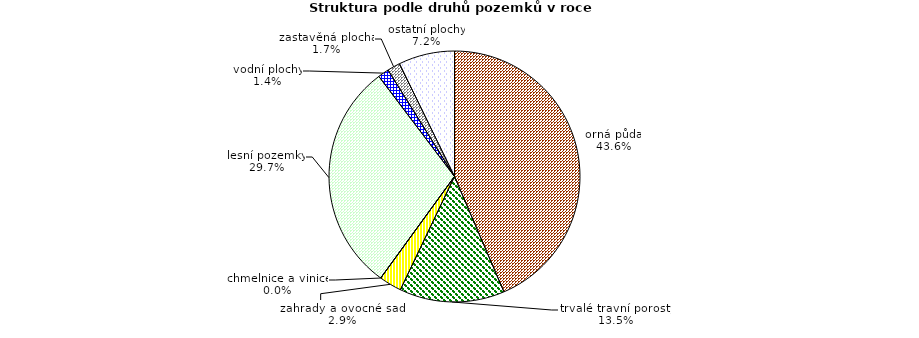
| Category | Struktura druhů pozemků |
|---|---|
| orná půda | 196823 |
| trvalé travní porosty | 61185 |
| zahrady a ovocné sady | 13138 |
| chmelnice a vinice | 0 |
| lesní pozemky | 134181 |
| vodní plochy | 6417 |
| zastavěná plocha | 7462 |
| ostatní plochy | 32685 |